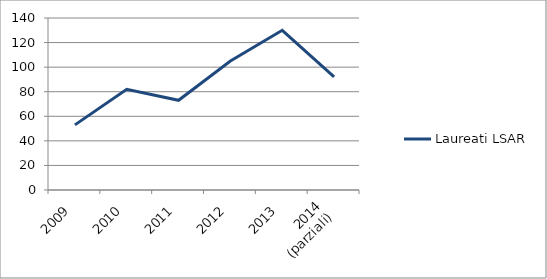
| Category | Laureati LSAR |
|---|---|
| 2009 | 53 |
| 2010 | 82 |
| 2011 | 73 |
| 2012 | 105 |
| 2013 | 130 |
| 2014
(parziali) | 92 |